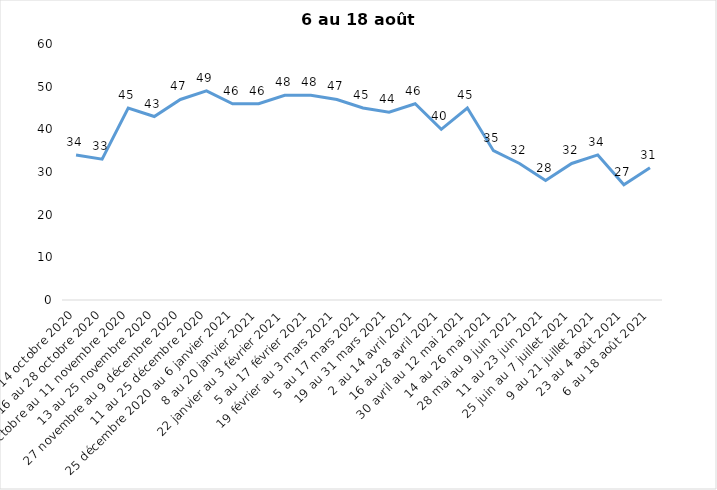
| Category | Toujours aux trois mesures |
|---|---|
| 2 au 14 octobre 2020 | 34 |
| 16 au 28 octobre 2020 | 33 |
| 30 octobre au 11 novembre 2020 | 45 |
| 13 au 25 novembre 2020 | 43 |
| 27 novembre au 9 décembre 2020 | 47 |
| 11 au 25 décembre 2020 | 49 |
| 25 décembre 2020 au 6 janvier 2021 | 46 |
| 8 au 20 janvier 2021 | 46 |
| 22 janvier au 3 février 2021 | 48 |
| 5 au 17 février 2021 | 48 |
| 19 février au 3 mars 2021 | 47 |
| 5 au 17 mars 2021 | 45 |
| 19 au 31 mars 2021 | 44 |
| 2 au 14 avril 2021 | 46 |
| 16 au 28 avril 2021 | 40 |
| 30 avril au 12 mai 2021 | 45 |
| 14 au 26 mai 2021 | 35 |
| 28 mai au 9 juin 2021 | 32 |
| 11 au 23 juin 2021 | 28 |
| 25 juin au 7 juillet 2021 | 32 |
| 9 au 21 juillet 2021 | 34 |
| 23 au 4 août 2021 | 27 |
| 6 au 18 août 2021 | 31 |